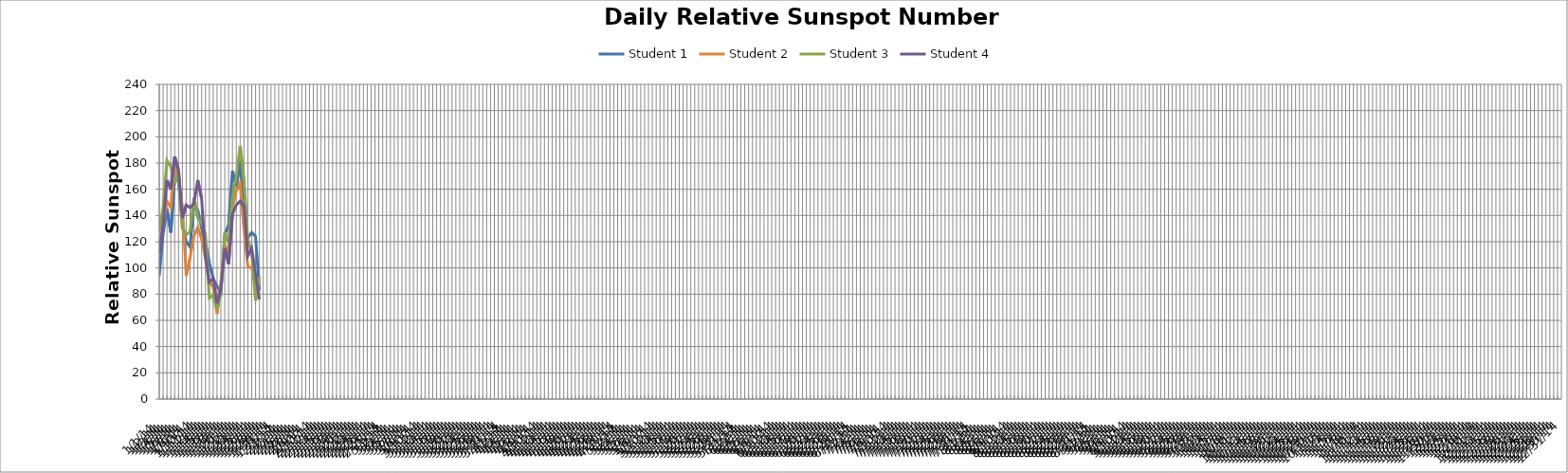
| Category | Student 1 | Student 2 | Student 3 | Student 4 |
|---|---|---|---|---|
| 1/1/14 | 94 | 114 | 128 | 111 |
| 1/2/14 | 126 | 134 | 147 | 133 |
| 1/3/14 | 145 | 151 | 182 | 167 |
| 1/4/14 | 127 | 146 | 177 | 160 |
| 1/5/14 | 169 | 178 | 164 | 185 |
| 1/6/14 | 166 | 168 | 174 | 175 |
| 1/7/14 | 134 | 147 | 130 | 138 |
| 1/8/14 | 120 | 94 | 125 | 148 |
| 1/9/14 | 116 | 108 | 128 | 146 |
| 1/10/14 | 149 | 124 | 154 | 149 |
| 1/11/14 | 144 | 131 | 138 | 167 |
| 1/12/14 | 130 | 122 | 134 | 153 |
| 1/13/14 | 120 | 107 | 126 | 108 |
| 1/14/14 | 104 | 90 | 77 | 89 |
| 1/15/14 | 92 | 85 | 79 | 92 |
| 1/16/14 | 86 | 65 | 68 | 73 |
| 1/17/14 | 81 | 89 | 82 | 84 |
| 1/18/14 | 125 | 118 | 127 | 115 |
| 1/19/14 | 133 | 111 | 119 | 103 |
| 1/20/14 | 174 | 146 | 154 | 141 |
| 1/21/14 | 162 | 159 | 170 | 148 |
| 1/22/14 | 182 | 165 | 193 | 151 |
| 1/23/14 | 134 | 129 | 167 | 147 |
| 1/24/14 | 123 | 101 | 122 | 109 |
| 1/25/14 | 127 | 100 | 111 | 115 |
| 1/26/14 | 124 | 86 | 75 | 95 |
| 1/27/14 | 83 | 82 | 93 | 76 |